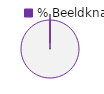
| Category | 8 - Beeldknap |
|---|---|
| 0 | 0 |
| 1 | 1 |